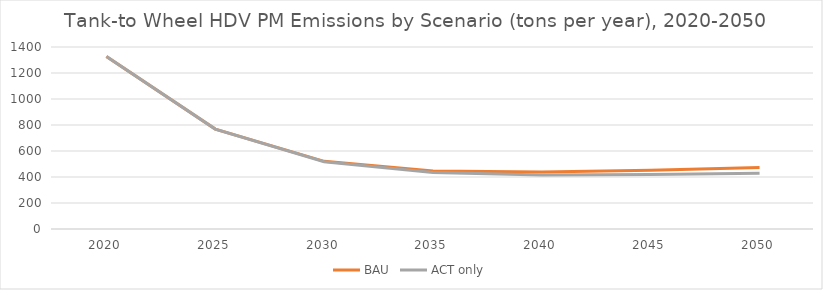
| Category | BAU | ACT only |
|---|---|---|
| 2020.0 | 1326.052 | 1326.052 |
| 2025.0 | 768.536 | 768.536 |
| 2030.0 | 520.599 | 517.27 |
| 2035.0 | 446.566 | 433.837 |
| 2040.0 | 439.16 | 416.304 |
| 2045.0 | 452.688 | 418.805 |
| 2050.0 | 473.546 | 429.781 |